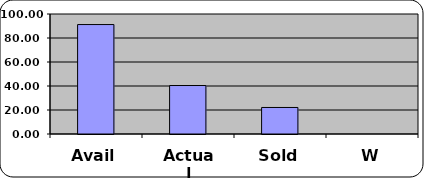
| Category | TOTAL |
|---|---|
| Avail | 91.2 |
| Actual | 40.4 |
| Sold | 22.1 |
| W | 0 |